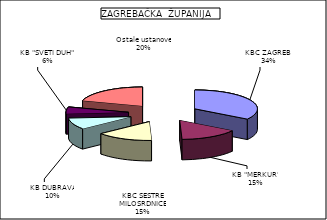
| Category | Series 0 |
|---|---|
| KBC ZAGREB  | 34.158 |
| KB "MERKUR" | 15.253 |
| KBC SESTRE MILOSRDNICE | 14.638 |
| KB DUBRAVA | 9.747 |
| KB "SVETI DUH" | 5.774 |
| Ostale ustanove | 20.43 |